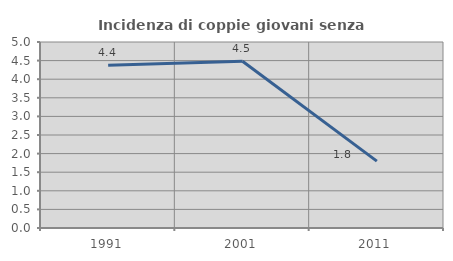
| Category | Incidenza di coppie giovani senza figli |
|---|---|
| 1991.0 | 4.373 |
| 2001.0 | 4.481 |
| 2011.0 | 1.798 |